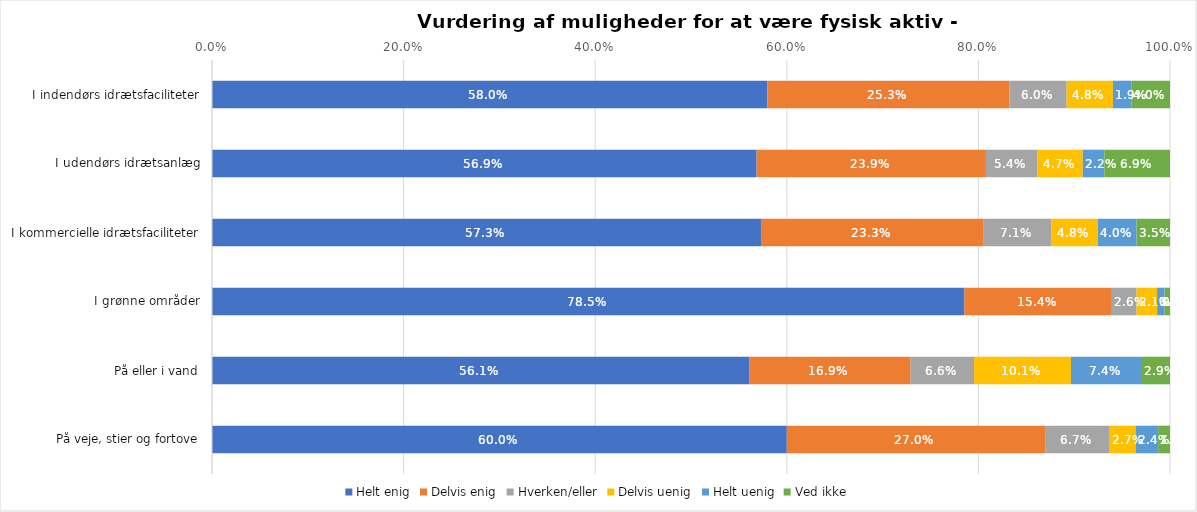
| Category | Helt enig | Delvis enig | Hverken/eller | Delvis uenig | Helt uenig | Ved ikke |
|---|---|---|---|---|---|---|
| I indendørs idrætsfaciliteter | 0.58 | 0.253 | 0.06 | 0.048 | 0.019 | 0.04 |
| I udendørs idrætsanlæg | 0.569 | 0.239 | 0.054 | 0.047 | 0.022 | 0.069 |
| I kommercielle idrætsfaciliteter | 0.573 | 0.233 | 0.071 | 0.048 | 0.04 | 0.035 |
| I grønne områder | 0.785 | 0.154 | 0.026 | 0.021 | 0.008 | 0.006 |
| På eller i vand | 0.561 | 0.169 | 0.066 | 0.101 | 0.074 | 0.029 |
| På veje, stier og fortove | 0.6 | 0.27 | 0.067 | 0.027 | 0.024 | 0.012 |